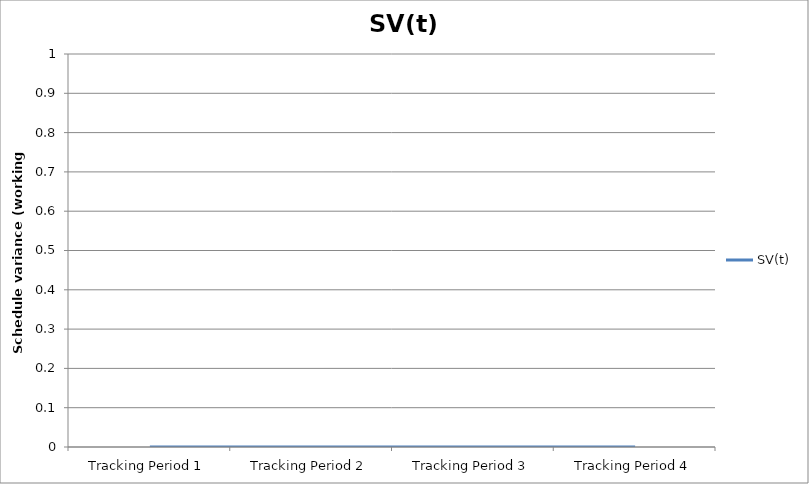
| Category | SV(t) |
|---|---|
| Tracking Period 1 | 0 |
| Tracking Period 2 | 0 |
| Tracking Period 3 | 0 |
| Tracking Period 4 | 0 |